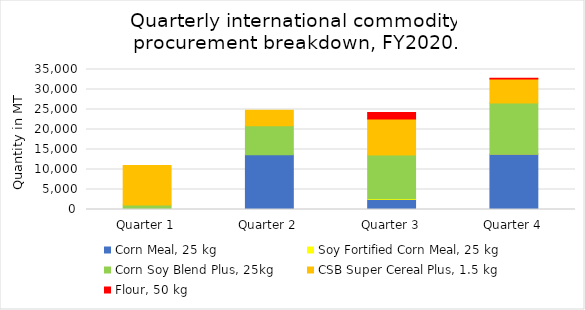
| Category | Corn Meal, 25 kg | Soy Fortified Corn Meal, 25 kg | Corn Soy Blend Plus, 25kg | CSB Super Cereal Plus, 1.5 kg | Flour, 50 kg |
|---|---|---|---|---|---|
| Quarter 1 | 0 | 0 | 1100 | 9900 | 0 |
| Quarter 2 | 13670 | 0 | 7250 | 3900 | 0 |
| Quarter 3 | 2530 | 150 | 10950 | 9000 | 1630 |
| Quarter 4 | 13870 | 50 | 12690 | 6000 | 220 |